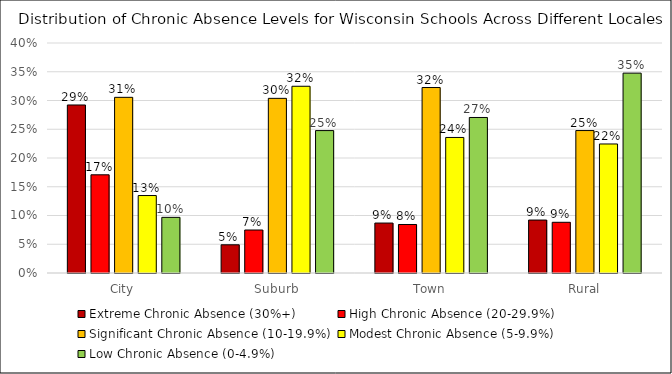
| Category | Extreme Chronic Absence (30%+) | High Chronic Absence (20-29.9%) | Significant Chronic Absence (10-19.9%) | Modest Chronic Absence (5-9.9%) | Low Chronic Absence (0-4.9%) |
|---|---|---|---|---|---|
| City | 0.292 | 0.171 | 0.306 | 0.135 | 0.097 |
| Suburb | 0.049 | 0.075 | 0.304 | 0.325 | 0.248 |
| Town | 0.087 | 0.084 | 0.323 | 0.236 | 0.27 |
| Rural | 0.092 | 0.088 | 0.248 | 0.224 | 0.348 |